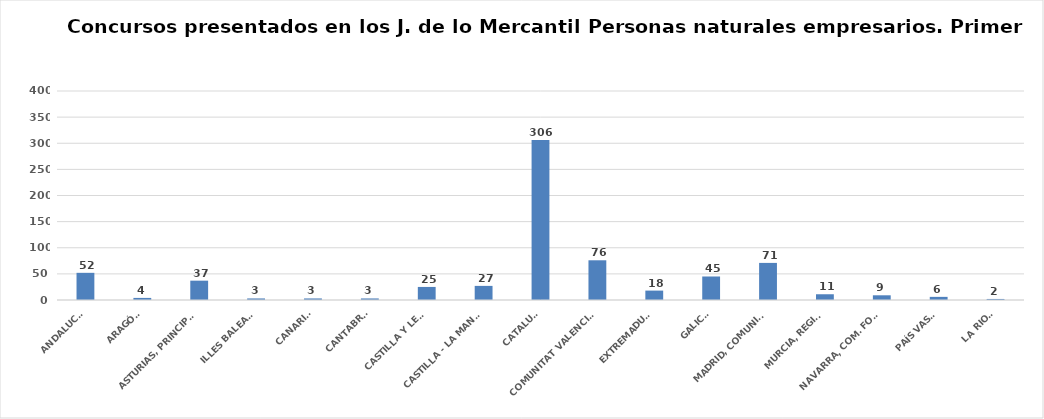
| Category | Series 0 |
|---|---|
| ANDALUCÍA | 52 |
| ARAGÓN | 4 |
| ASTURIAS, PRINCIPADO | 37 |
| ILLES BALEARS | 3 |
| CANARIAS | 3 |
| CANTABRIA | 3 |
| CASTILLA Y LEÓN | 25 |
| CASTILLA - LA MANCHA | 27 |
| CATALUÑA | 306 |
| COMUNITAT VALENCIANA | 76 |
| EXTREMADURA | 18 |
| GALICIA | 45 |
| MADRID, COMUNIDAD | 71 |
| MURCIA, REGIÓN | 11 |
| NAVARRA, COM. FORAL | 9 |
| PAÍS VASCO | 6 |
| LA RIOJA | 2 |